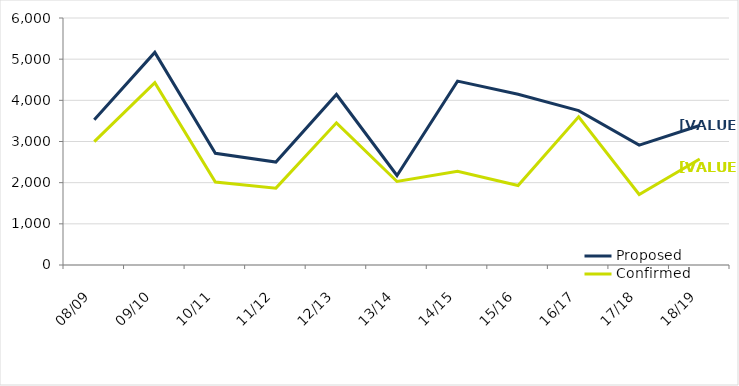
| Category | Proposed | Confirmed |
|---|---|---|
| 08/09 | 3530 | 2998 |
| 09/10 | 5165 | 4428 |
| 10/11 | 2713 | 2015 |
| 11/12 | 2500 | 1867 |
| 12/13 | 4142 | 3453 |
| 13/14 | 2174 | 2028 |
| 14/15 | 4467 | 2276 |
| 15/16 | 4147 | 1932 |
| 16/17 | 3750 | 3599 |
| 17/18 | 2911 | 1712 |
| 18/19 | 3388 | 2575 |